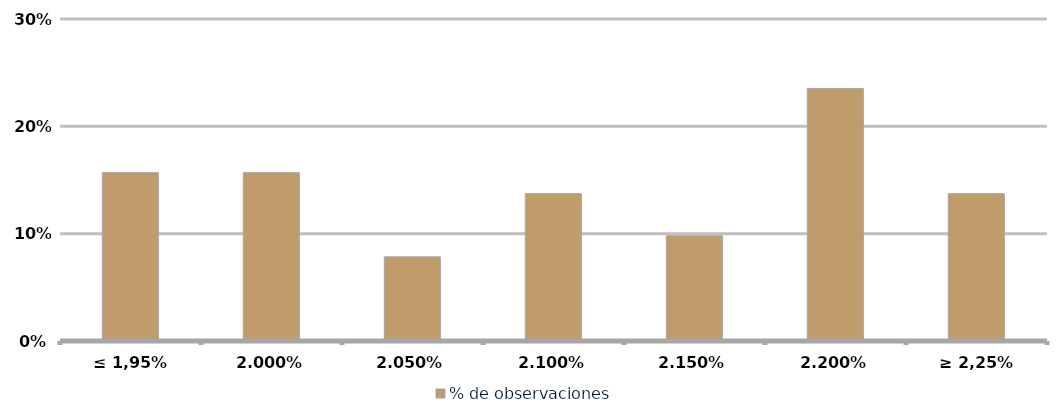
| Category | % de observaciones  |
|---|---|
| ≤ 1,95% | 0.157 |
| 2,00% | 0.157 |
| 2,05% | 0.078 |
| 2,10% | 0.137 |
| 2,15% | 0.098 |
| 2,20% | 0.235 |
| ≥ 2,25% | 0.137 |